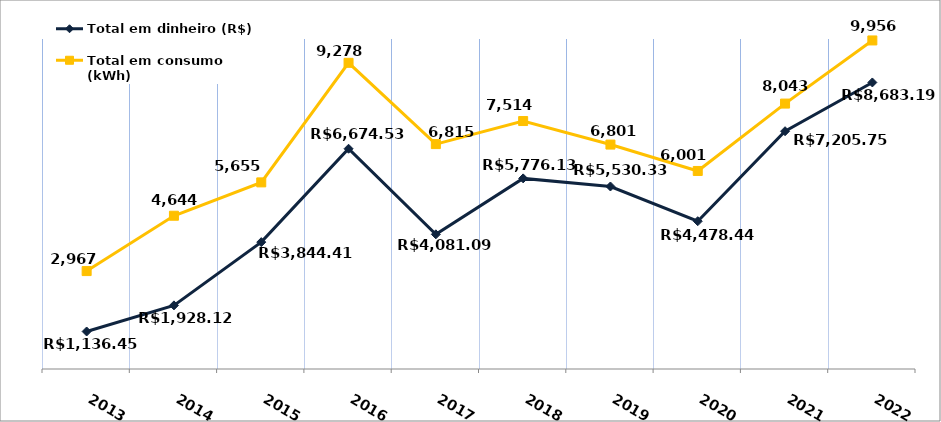
| Category | Total em dinheiro (R$) |
|---|---|
| 2013.0 | 1136.45 |
| 2014.0 | 1928.12 |
| 2015.0 | 3844.41 |
| 2016.0 | 6674.53 |
| 2017.0 | 4081.09 |
| 2018.0 | 5776.13 |
| 2019.0 | 5530.33 |
| 2020.0 | 4478.44 |
| 2021.0 | 7205.75 |
| 2022.0 | 8683.19 |